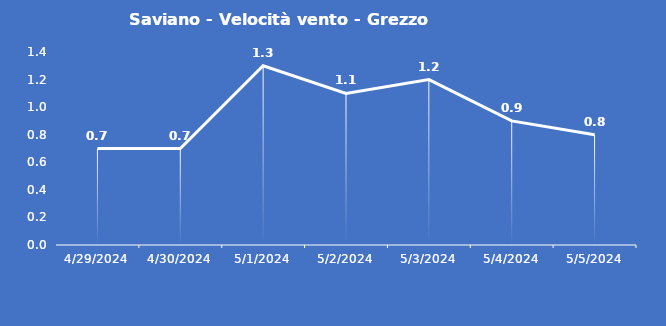
| Category | Saviano - Velocità vento - Grezzo (m/s) |
|---|---|
| 4/29/24 | 0.7 |
| 4/30/24 | 0.7 |
| 5/1/24 | 1.3 |
| 5/2/24 | 1.1 |
| 5/3/24 | 1.2 |
| 5/4/24 | 0.9 |
| 5/5/24 | 0.8 |